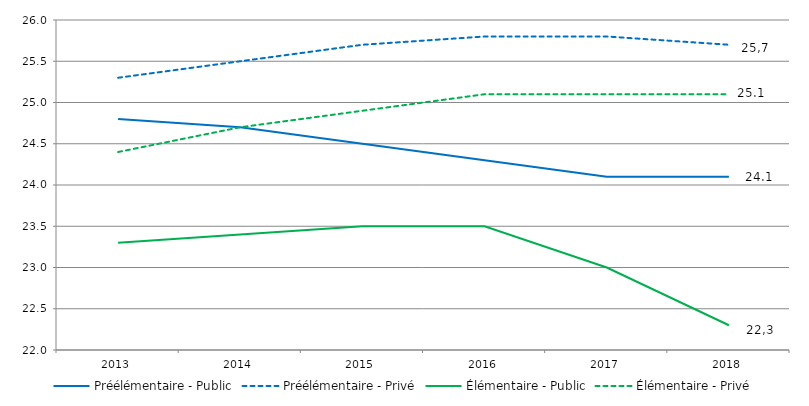
| Category | Préélémentaire - Public | Préélémentaire - Privé | Élémentaire - Public | Élémentaire - Privé |
|---|---|---|---|---|
| 2013.0 | 24.8 | 25.3 | 23.3 | 24.4 |
| 2014.0 | 24.7 | 25.5 | 23.4 | 24.7 |
| 2015.0 | 24.5 | 25.7 | 23.5 | 24.9 |
| 2016.0 | 24.3 | 25.8 | 23.5 | 25.1 |
| 2017.0 | 24.1 | 25.8 | 23 | 25.1 |
| 2018.0 | 24.1 | 25.7 | 22.3 | 25.1 |